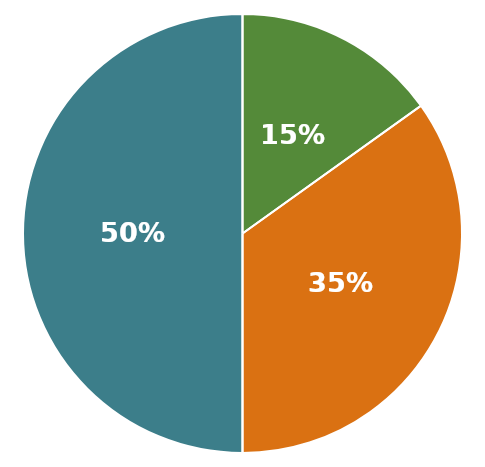
| Category | Summa Varat |
|---|---|
| 0 | 1902500 |
| 1 | 575000 |
| 2 | 1327500 |